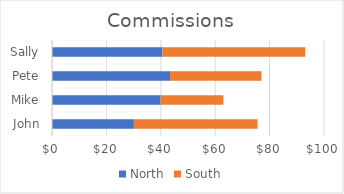
| Category | North | South |
|---|---|---|
| John | 30.1 | 45.5 |
| Mike | 39.9 | 23.1 |
| Pete | 43.4 | 33.6 |
| Sally | 40.6 | 52.5 |